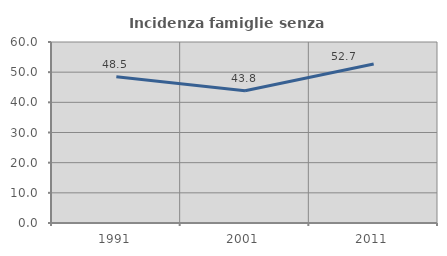
| Category | Incidenza famiglie senza nuclei |
|---|---|
| 1991.0 | 48.504 |
| 2001.0 | 43.829 |
| 2011.0 | 52.735 |